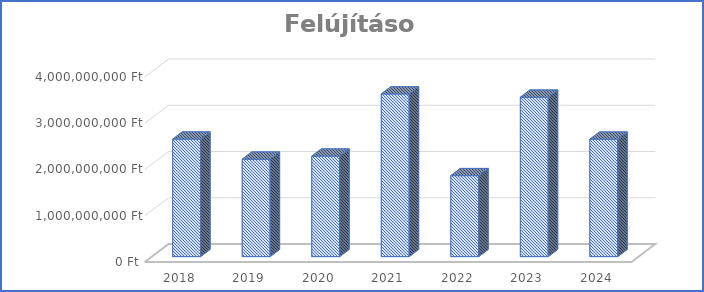
| Category | Felújítások |
|---|---|
| 2018.0 | 2541000000 |
| 2019.0 | 2106398640 |
| 2020.0 | 2172637463 |
| 2021.0 | 3516708367 |
| 2022.0 | 1750613560 |
| 2023.0 | 3446151278 |
| 2024.0 | 2538961266 |